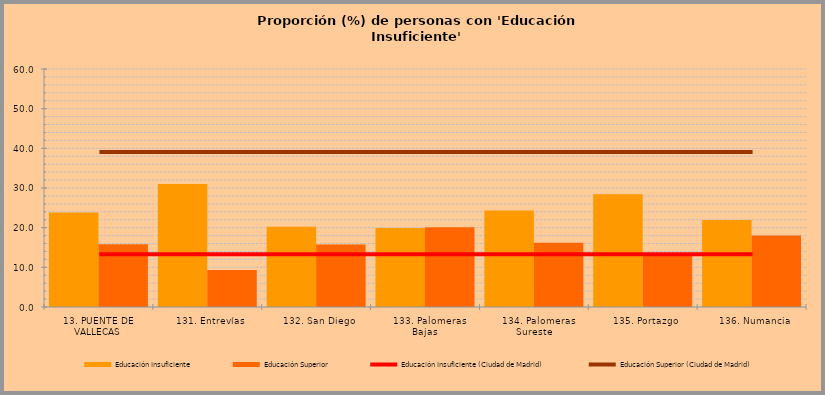
| Category | Educación Insuficiente | Educación Superior |
|---|---|---|
| 13. PUENTE DE VALLECAS | 23.805 | 15.846 |
|    131. Entrevías | 31.018 | 9.305 |
|    132. San Diego | 20.245 | 15.763 |
|    133. Palomeras Bajas | 19.912 | 20.121 |
|    134. Palomeras Sureste | 24.349 | 16.211 |
|    135. Portazgo | 28.432 | 13.558 |
|    136. Numancia | 21.922 | 18.017 |